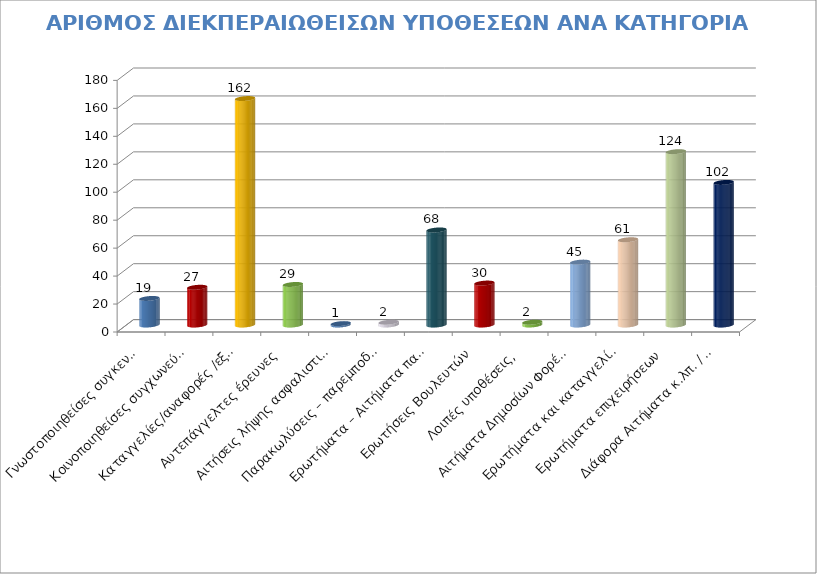
| Category | Series 0 |
|---|---|
| Γνωστοποιηθείσες συγκεντρώσεις | 19 |
| Κοινοποιηθείσες συγχωνεύσεις επιχειρήσεων | 27 |
| Καταγγελίες/αναφορές /εξώδικα /διαμαρτυρίες | 162 |
| Αυτεπάγγελτες έρευνες  | 29 |
| Αιτήσεις λήψης ασφαλιστικών μέτρων | 1 |
| Παρακωλύσεις – παρεμποδίσεις ερευνών | 2 |
| Ερωτήματα – Αιτήματα παροχής στοιχείων  | 68 |
| Ερωτήσεις Βουλευτών | 30 |
| Λοιπές υποθέσεις,  | 2 |
| Αιτήματα Δημοσίων Φορέων επί θεμάτων ανταγωνισμού | 45 |
| Ερωτήματα και καταγγελίες πολιτών από ιστοσελίδα Ε.Α. | 61 |
| Ερωτήματα επιχειρήσεων | 124 |
| Διάφορα Αιτήματα κ.λπ. / Αταξινόμητα | 102 |